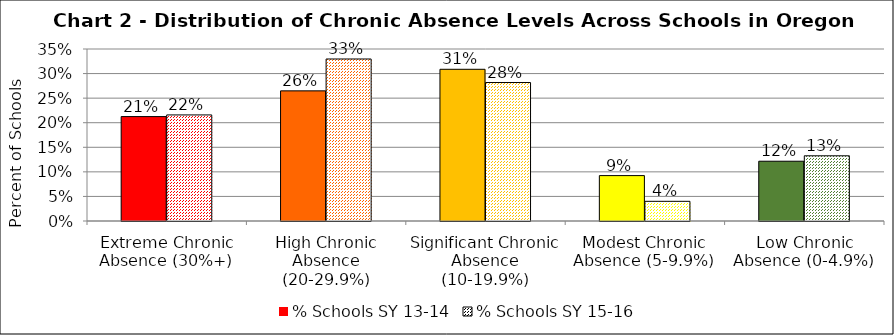
| Category | % Schools SY 13-14 | % Schools SY 15-16 |
|---|---|---|
| Extreme Chronic Absence (30%+) | 0.212 | 0.216 |
| High Chronic Absence (20-29.9%) | 0.265 | 0.33 |
| Significant Chronic Absence (10-19.9%) | 0.309 | 0.282 |
| Modest Chronic Absence (5-9.9%) | 0.092 | 0.04 |
| Low Chronic Absence (0-4.9%) | 0.122 | 0.133 |